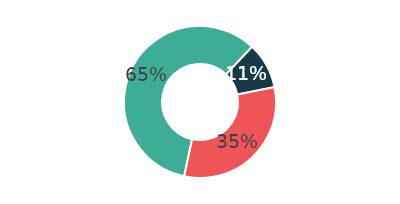
| Category | Series 0 |
|---|---|
| 0 | 65.1 |
| 1 | 10.891 |
| 2 | 34.9 |